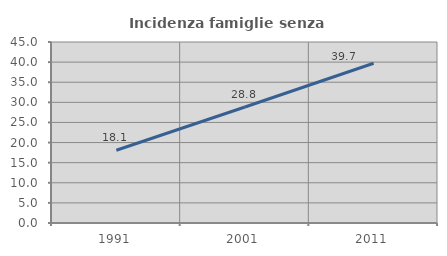
| Category | Incidenza famiglie senza nuclei |
|---|---|
| 1991.0 | 18.084 |
| 2001.0 | 28.844 |
| 2011.0 | 39.713 |